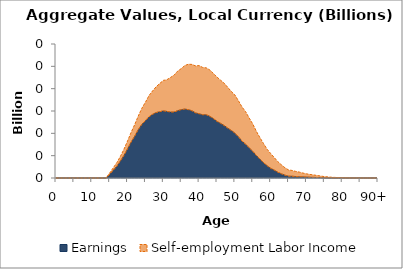
| Category | Earnings | Self-employment Labor Income |
|---|---|---|
| 0 | 0 | 0 |
|  | 0 | 0 |
| 2 | 0 | 0 |
| 3 | 0 | 0 |
| 4 | 0 | 0 |
| 5 | 0 | 0 |
| 6 | 0 | 0 |
| 7 | 0 | 0 |
| 8 | 0 | 0 |
| 9 | 0 | 0 |
| 10 | 0 | 0 |
| 11 | 0 | 0 |
| 12 | 0 | 0 |
| 13 | 0 | 0 |
| 14 | 0 | 0.082 |
| 15 | 3.333 | 1.115 |
| 16 | 6.92 | 2.154 |
| 17 | 10.533 | 3.2 |
| 18 | 15.218 | 4.136 |
| 19 | 20.24 | 5.577 |
| 20 | 26.09 | 7.042 |
| 21 | 32.21 | 8.638 |
| 22 | 37.454 | 10.394 |
| 23 | 43.33 | 12.175 |
| 24 | 48.054 | 14.379 |
| 25 | 51.424 | 16.435 |
| 26 | 54.828 | 18.993 |
| 27 | 57.011 | 20.952 |
| 28 | 58.628 | 23.098 |
| 29 | 59.386 | 25.255 |
| 30 | 60.121 | 27.269 |
| 31 | 59.649 | 28.38 |
| 32 | 59.042 | 30.996 |
| 33 | 59.037 | 33.056 |
| 34 | 60.299 | 35.406 |
| 35 | 61.192 | 36.751 |
| 36 | 61.727 | 38.989 |
| 37 | 61.203 | 40.668 |
| 38 | 60.197 | 41.515 |
| 39 | 58.292 | 42.101 |
| 40 | 57.511 | 43.17 |
| 41 | 56.63 | 42.366 |
| 42 | 56.643 | 41.982 |
| 43 | 55.193 | 41.518 |
| 44 | 53.204 | 40.404 |
| 45 | 50.695 | 39.641 |
| 46 | 48.948 | 38.631 |
| 47 | 46.981 | 37.938 |
| 48 | 44.644 | 36.582 |
| 49 | 42.61 | 34.859 |
| 50 | 40.181 | 34.168 |
| 51 | 36.86 | 32.258 |
| 52 | 33.022 | 30.544 |
| 53 | 30.229 | 29.17 |
| 54 | 27.052 | 26.651 |
| 55 | 23.859 | 24.502 |
| 56 | 20.188 | 21.653 |
| 57 | 16.878 | 19.278 |
| 58 | 13.773 | 17.108 |
| 59 | 11.024 | 14.761 |
| 60 | 8.678 | 13.247 |
| 61 | 7.049 | 11.261 |
| 62 | 5.173 | 9.458 |
| 63 | 3.747 | 8.073 |
| 64 | 2.518 | 6.642 |
| 65 | 1.64 | 5.569 |
| 66 | 1.595 | 5.167 |
| 67 | 1.285 | 4.615 |
| 68 | 1.202 | 4.088 |
| 69 | 1.032 | 3.417 |
| 70 | 0.897 | 2.843 |
| 71 | 0.692 | 2.5 |
| 72 | 0.58 | 2.163 |
| 73 | 0.459 | 1.772 |
| 74 | 0.358 | 1.404 |
| 75 | 0.206 | 1.033 |
| 76 | 0.156 | 0.812 |
| 77 | 0.082 | 0.603 |
| 78 | 0.049 | 0.459 |
| 79 | 0.035 | 0.363 |
| 80 | 0.022 | 0.217 |
| 81 | 0.009 | 0.129 |
| 82 | 0.007 | 0.097 |
| 83 | 0.006 | 0.068 |
| 84 | 0.004 | 0.045 |
| 85 | 0.003 | 0.029 |
| 86 | 0.002 | 0.016 |
| 87 | 0.002 | 0.009 |
| 88 | 0.002 | 0.004 |
| 89 | 0.001 | 0.001 |
| 90+ | 0.003 | 0 |